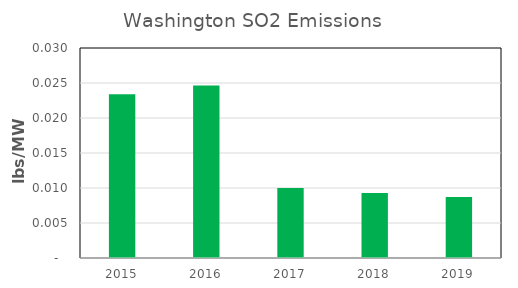
| Category | Series 0 |
|---|---|
| 2015.0 | 0.023 |
| 2016.0 | 0.025 |
| 2017.0 | 0.01 |
| 2018.0 | 0.009 |
| 2019.0 | 0.009 |